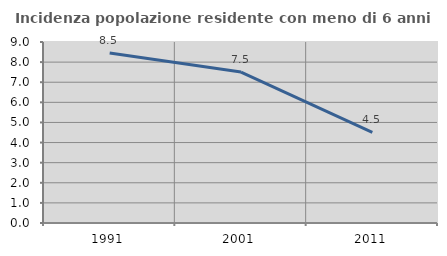
| Category | Incidenza popolazione residente con meno di 6 anni |
|---|---|
| 1991.0 | 8.458 |
| 2001.0 | 7.504 |
| 2011.0 | 4.504 |